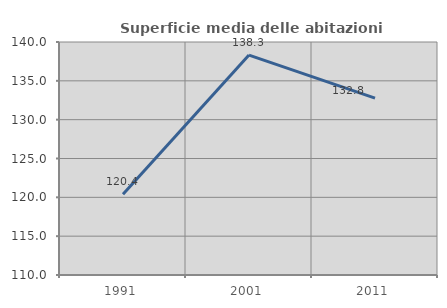
| Category | Superficie media delle abitazioni occupate |
|---|---|
| 1991.0 | 120.406 |
| 2001.0 | 138.314 |
| 2011.0 | 132.781 |